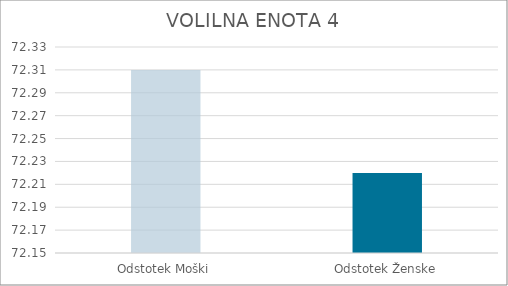
| Category | Series 0 |
|---|---|
| Odstotek Moški | 72.31 |
| Odstotek Ženske | 72.22 |